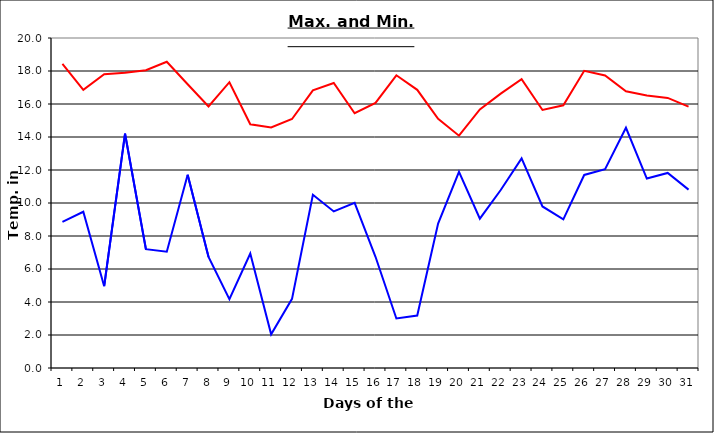
| Category | Series 0 | Series 1 |
|---|---|---|
| 0 | 18.43 | 8.86 |
| 1 | 16.86 | 9.47 |
| 2 | 17.8 | 4.96 |
| 3 | 17.9 | 14.2 |
| 4 | 18.05 | 7.2 |
| 5 | 18.56 | 7.05 |
| 6 | 17.2 | 11.71 |
| 7 | 15.85 | 6.73 |
| 8 | 17.32 | 4.17 |
| 9 | 14.77 | 6.94 |
| 10 | 14.58 | 2.04 |
| 11 | 15.09 | 4.19 |
| 12 | 16.83 | 10.5 |
| 13 | 17.27 | 9.49 |
| 14 | 15.44 | 10.01 |
| 15 | 16.07 | 6.74 |
| 16 | 17.74 | 3 |
| 17 | 16.86 | 3.18 |
| 18 | 15.1 | 8.75 |
| 19 | 14.08 | 11.89 |
| 20 | 15.67 | 9.05 |
| 21 | 16.63 | 10.79 |
| 22 | 17.5 | 12.7 |
| 23 | 15.64 | 9.79 |
| 24 | 15.92 | 9.01 |
| 25 | 18.01 | 11.7 |
| 26 | 17.73 | 12.05 |
| 27 | 16.77 | 14.56 |
| 28 | 16.52 | 11.48 |
| 29 | 16.37 | 11.82 |
| 30 | 15.84 | 10.81 |